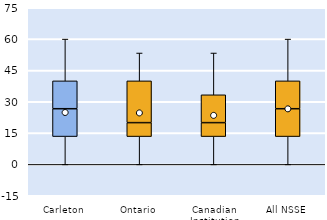
| Category | 25th | 50th | 75th |
|---|---|---|---|
| Carleton | 13.333 | 13.333 | 13.333 |
| Ontario | 13.333 | 6.667 | 20 |
| Canadian Institution | 13.333 | 6.667 | 13.333 |
| All NSSE | 13.333 | 13.333 | 13.333 |